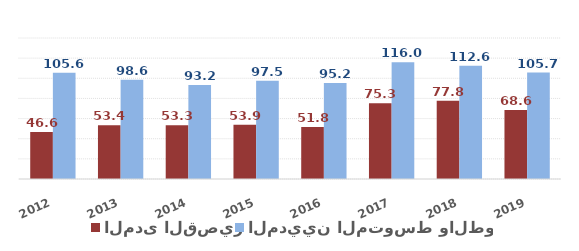
| Category | المدى القصير | المديين المتوسط والطويل |
|---|---|---|
| 2012.0 | 46.625 | 105.569 |
| 2013.0 | 53.373 | 98.564 |
| 2014.0 | 53.328 | 93.213 |
| 2015.0 | 53.858 | 97.469 |
| 2016.0 | 51.754 | 95.223 |
| 2017.0 | 75.312 | 116.036 |
| 2018.0 | 77.787 | 112.57 |
| 2019.0 | 68.594 | 105.673 |